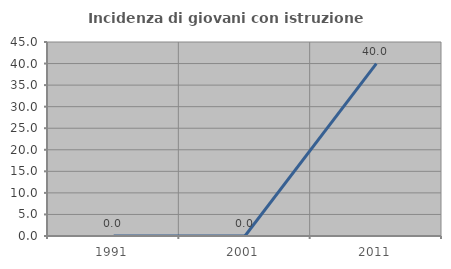
| Category | Incidenza di giovani con istruzione universitaria |
|---|---|
| 1991.0 | 0 |
| 2001.0 | 0 |
| 2011.0 | 40 |